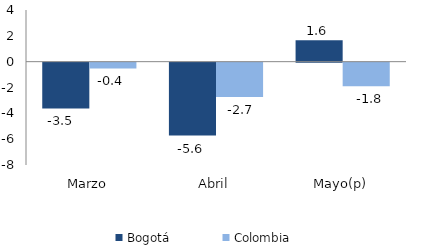
| Category | Bogotá | Colombia |
|---|---|---|
| Marzo | -3.541 | -0.444 |
| Abril | -5.64 | -2.658 |
| Mayo(p) | 1.649 | -1.817 |